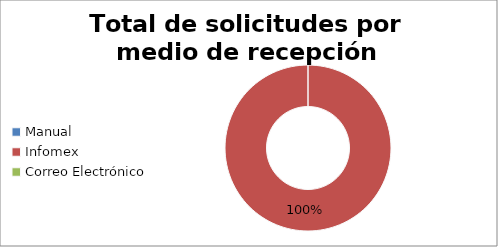
| Category | totales |
|---|---|
| Manual | 0 |
| Infomex | 5 |
| Correo Electrónico | 0 |